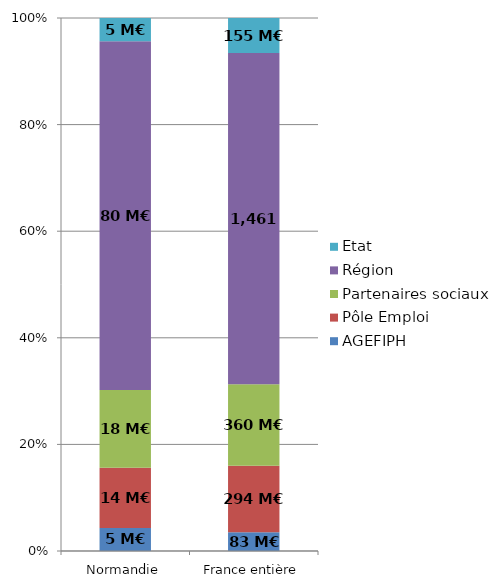
| Category | AGEFIPH | Pôle Emploi | Partenaires sociaux | Région | Etat |
|---|---|---|---|---|---|
| Normandie | 5.297 | 13.836 | 17.912 | 80.252 | 5.344 |
| France entière | 82.716 | 293.959 | 359.593 | 1461.057 | 154.74 |